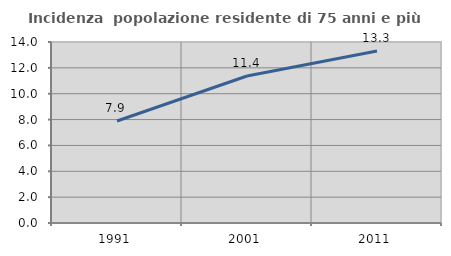
| Category | Incidenza  popolazione residente di 75 anni e più |
|---|---|
| 1991.0 | 7.892 |
| 2001.0 | 11.369 |
| 2011.0 | 13.31 |